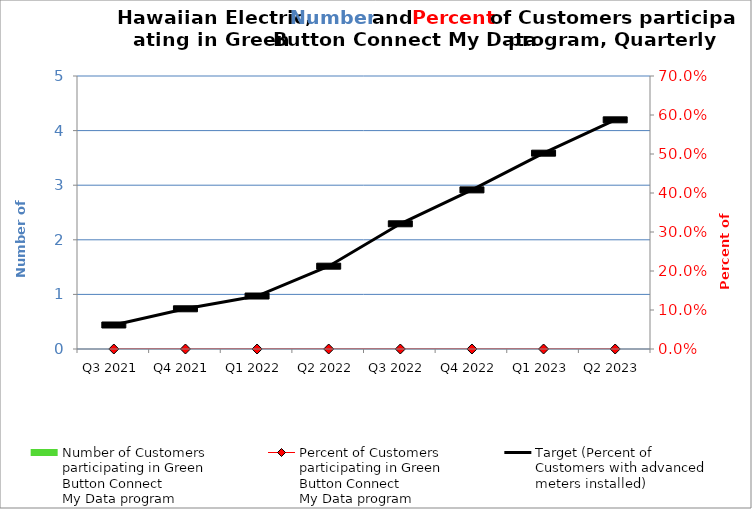
| Category | Number of Customers
participating in Green
Button Connect
My Data program |
|---|---|
| Q3 2021 | 0 |
| Q4 2021 | 0 |
| Q1 2022 | 0 |
| Q2 2022 | 0 |
| Q3 2022 | 0 |
| Q4 2022 | 0 |
| Q1 2023 | 0 |
| Q2 2023 | 0 |